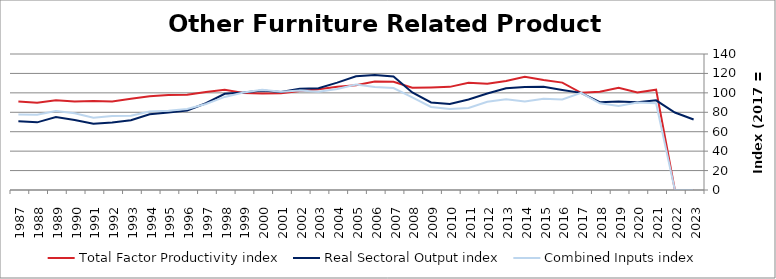
| Category | Total Factor Productivity index | Real Sectoral Output index | Combined Inputs index |
|---|---|---|---|
| 2023.0 | 0 | 72.616 | 0 |
| 2022.0 | 0 | 79.735 | 0 |
| 2021.0 | 103.291 | 92.284 | 89.344 |
| 2020.0 | 100.275 | 90.377 | 90.129 |
| 2019.0 | 105.313 | 91.072 | 86.477 |
| 2018.0 | 101.206 | 90.351 | 89.274 |
| 2017.0 | 100 | 100 | 100 |
| 2016.0 | 110.565 | 102.998 | 93.156 |
| 2015.0 | 113.234 | 106.369 | 93.937 |
| 2014.0 | 116.526 | 106.126 | 91.075 |
| 2013.0 | 112.143 | 104.689 | 93.353 |
| 2012.0 | 109.354 | 99.254 | 90.764 |
| 2011.0 | 110.344 | 93.096 | 84.369 |
| 2010.0 | 106.168 | 88.635 | 83.486 |
| 2009.0 | 105.534 | 90.168 | 85.44 |
| 2008.0 | 105.278 | 100.442 | 95.406 |
| 2007.0 | 111.336 | 116.899 | 104.996 |
| 2006.0 | 111.723 | 118.479 | 106.046 |
| 2005.0 | 107.876 | 117.1 | 108.551 |
| 2004.0 | 106.295 | 110.495 | 103.952 |
| 2003.0 | 103.706 | 104.789 | 101.044 |
| 2002.0 | 101.783 | 104.214 | 102.388 |
| 2001.0 | 99.66 | 100.922 | 101.267 |
| 2000.0 | 99.255 | 102.488 | 103.258 |
| 1999.0 | 99.962 | 100.308 | 100.347 |
| 1998.0 | 103.305 | 99.002 | 95.834 |
| 1997.0 | 100.815 | 89.311 | 88.589 |
| 1996.0 | 98.11 | 81.893 | 83.471 |
| 1995.0 | 97.796 | 79.786 | 81.584 |
| 1994.0 | 96.482 | 77.96 | 80.803 |
| 1993.0 | 94.048 | 71.86 | 76.407 |
| 1992.0 | 91.223 | 69.377 | 76.052 |
| 1991.0 | 91.509 | 68.123 | 74.445 |
| 1990.0 | 91.058 | 71.967 | 79.035 |
| 1989.0 | 92.274 | 75.036 | 81.319 |
| 1988.0 | 89.782 | 69.631 | 77.555 |
| 1987.0 | 91.061 | 70.781 | 77.729 |